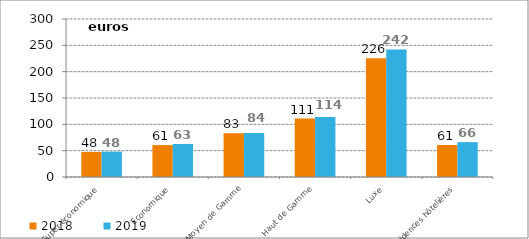
| Category | 2018 | 2019 |
|---|---|---|
| Super-économique | 47.651 | 48.251 |
| Economique | 60.632 | 62.72 |
| Moyen de Gamme | 82.955 | 83.602 |
| Haut de Gamme | 110.885 | 113.757 |
| Luxe | 225.559 | 242.138 |
| Résidences hôtelières | 60.766 | 66.184 |